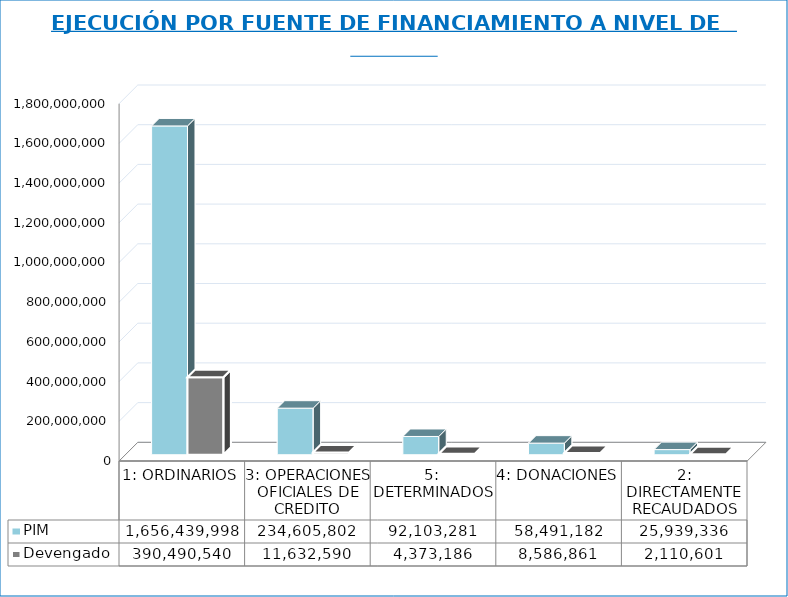
| Category | PIM | Devengado  |
|---|---|---|
| 1: ORDINARIOS | 1656439998 | 390490540 |
| 3: OPERACIONES OFICIALES DE CREDITO | 234605802 | 11632590 |
| 5:  DETERMINADOS | 92103281 | 4373186 |
| 4: DONACIONES | 58491182 | 8586861 |
| 2: DIRECTAMENTE RECAUDADOS | 25939336 | 2110601 |